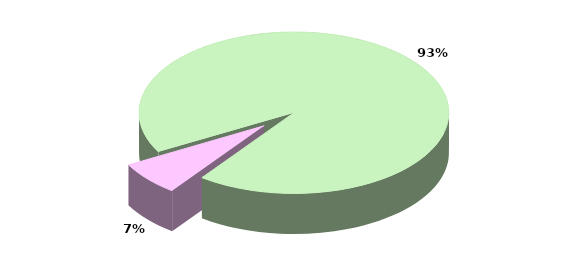
| Category | Series 0 |
|---|---|
| TOTALE ENTRATE CORRENTI | 23015.66 |
| TOTALE ENTRATE IN CONTO CAPITALE | 1684.097 |